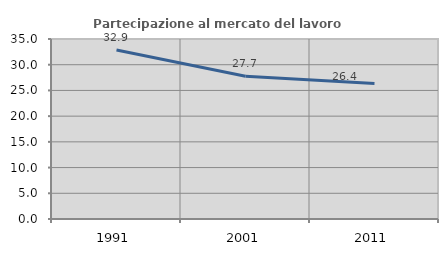
| Category | Partecipazione al mercato del lavoro  femminile |
|---|---|
| 1991.0 | 32.859 |
| 2001.0 | 27.742 |
| 2011.0 | 26.356 |